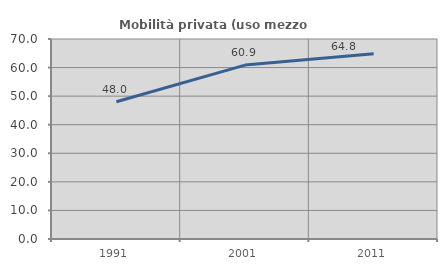
| Category | Mobilità privata (uso mezzo privato) |
|---|---|
| 1991.0 | 48.028 |
| 2001.0 | 60.87 |
| 2011.0 | 64.844 |